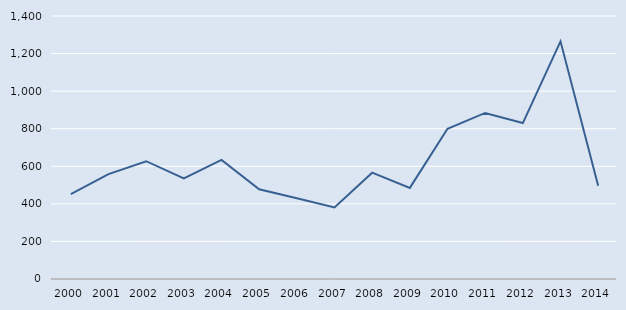
| Category | Series 0 |
|---|---|
| 2000.0 | 452 |
| 2001.0 | 558 |
| 2002.0 | 627 |
| 2003.0 | 536 |
| 2004.0 | 634 |
| 2005.0 | 478 |
| 2006.0 | 430 |
| 2007.0 | 381 |
| 2008.0 | 566 |
| 2009.0 | 485 |
| 2010.0 | 800 |
| 2011.0 | 884 |
| 2012.0 | 830 |
| 2013.0 | 1265 |
| 2014.0 | 496 |